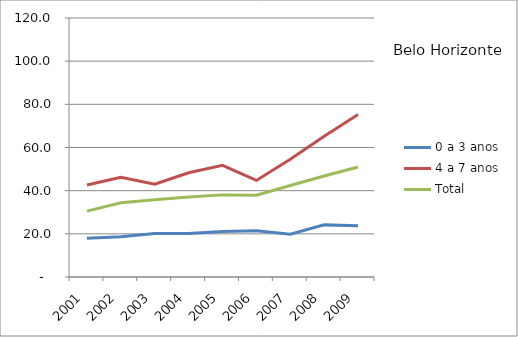
| Category | 0 a 3 anos | 4 a 7 anos | Total |
|---|---|---|---|
| 2001.0 | 17.96 | 42.6 | 30.54 |
| 2002.0 | 18.6 | 46.16 | 34.38 |
| 2003.0 | 20.13 | 42.98 | 35.76 |
| 2004.0 | 20.11 | 48.31 | 37.02 |
| 2005.0 | 21.04 | 51.71 | 38.05 |
| 2006.0 | 21.48 | 44.75 | 37.93 |
| 2007.0 | 19.8 | 54.52 | 42.42 |
| 2008.0 | 24.15 | 65.21 | 46.81 |
| 2009.0 | 23.73 | 75.32 | 50.99 |